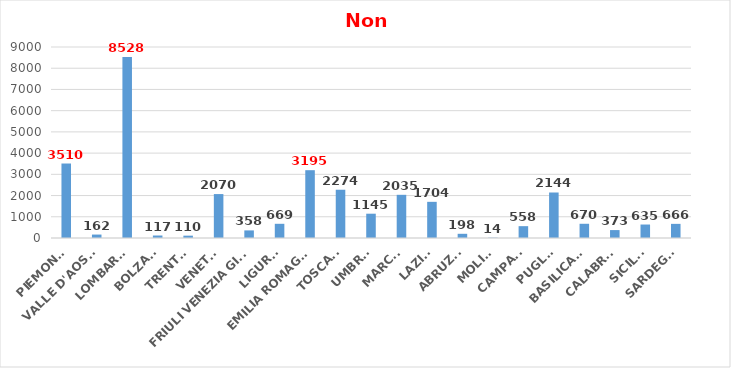
| Category | Series 0 |
|---|---|
| PIEMONTE | 3510 |
| VALLE D'AOSTA | 162 |
| LOMBARDIA | 8528 |
| BOLZANO | 117 |
| TRENTO | 110 |
| VENETO | 2070 |
| FRIULI VENEZIA GIULIA | 358 |
| LIGURIA | 669 |
| EMILIA ROMAGNA | 3195 |
| TOSCANA | 2274 |
| UMBRIA | 1145 |
| MARCHE | 2035 |
| LAZIO | 1704 |
| ABRUZZO | 198 |
| MOLISE | 14 |
| CAMPANIA | 558 |
| PUGLIA | 2144 |
| BASILICATA | 670 |
| CALABRIA | 373 |
| SICILIA | 635 |
| SARDEGNA | 666 |